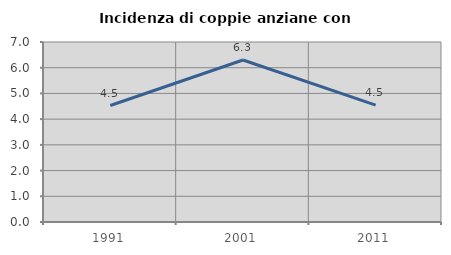
| Category | Incidenza di coppie anziane con figli |
|---|---|
| 1991.0 | 4.53 |
| 2001.0 | 6.299 |
| 2011.0 | 4.545 |